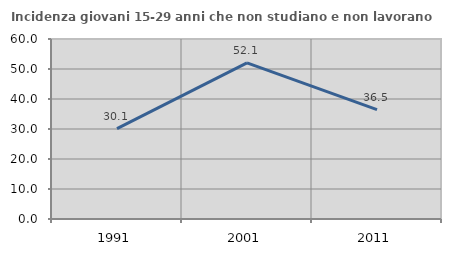
| Category | Incidenza giovani 15-29 anni che non studiano e non lavorano  |
|---|---|
| 1991.0 | 30.097 |
| 2001.0 | 52.058 |
| 2011.0 | 36.476 |